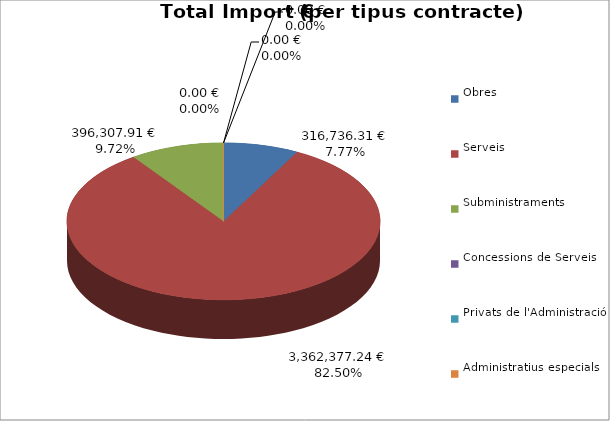
| Category | Total preu
(amb IVA) |
|---|---|
| Obres | 316736.31 |
| Serveis | 3362377.244 |
| Subministraments | 396307.91 |
| Concessions de Serveis | 0 |
| Privats de l'Administració | 0 |
| Administratius especials | 0 |